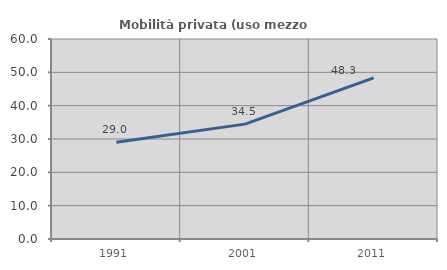
| Category | Mobilità privata (uso mezzo privato) |
|---|---|
| 1991.0 | 29.042 |
| 2001.0 | 34.465 |
| 2011.0 | 48.317 |